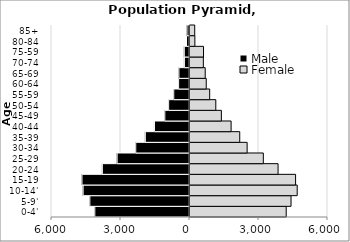
| Category | Male | Female |
|---|---|---|
| 0-4' | -4116.69 | 4183.23 |
| 5-9' | -4332.41 | 4392.78 |
| 10-14' | -4624.69 | 4661.58 |
| 15-19 | -4675.05 | 4590.67 |
| 20-24 | -3788.06 | 3829.04 |
| 25-29 | -3146.39 | 3188.02 |
| 30-34 | -2336.64 | 2484.2 |
| 35-39 | -1920.11 | 2162.67 |
| 40-44 | -1523.53 | 1786.86 |
| 45-49 | -1072.04 | 1363.89 |
| 50-54 | -906.51 | 1121.64 |
| 55-59 | -684.39 | 855.43 |
| 60-64 | -473.03 | 705.89 |
| 65-69 | -460.59 | 661.52 |
| 70-74 | -221.44 | 580.29 |
| 75-59 | -226.4 | 588.27 |
| 80-84 | -129.99 | 211.35 |
| 85+ | -109.59 | 205.34 |